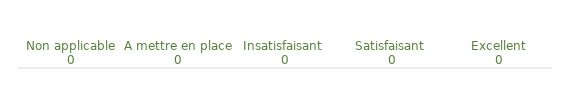
| Category | Choix Indicateurs |
|---|---|
| Non applicable | 0 |
| A mettre en place | 0 |
| Insatisfaisant  | 0 |
| Satisfaisant  | 0 |
| Excellent | 0 |